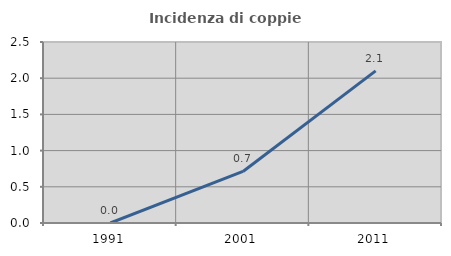
| Category | Incidenza di coppie miste |
|---|---|
| 1991.0 | 0 |
| 2001.0 | 0.712 |
| 2011.0 | 2.101 |